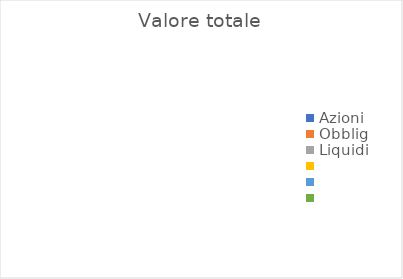
| Category | Valore totale |
|---|---|
| Azioni | 0 |
| Obblig | 0 |
| Liquidi | 0 |